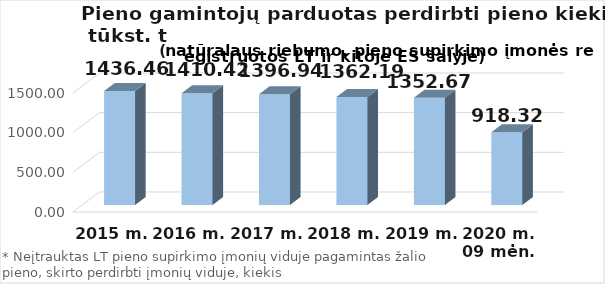
| Category | Viso |
|---|---|
| 2015 m. | 1436.455 |
| 2016 m. | 1410.42 |
| 2017 m.  | 1396.944 |
| 2018 m.  | 1362.189 |
| 2019 m.  | 1352.67 |
| 2020 m. 09 mėn. | 918.32 |